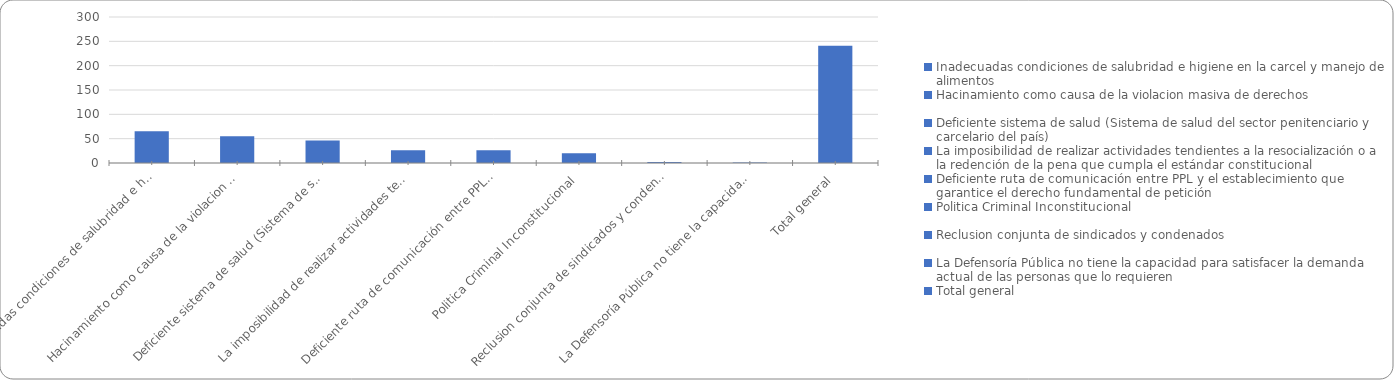
| Category | Recuento de COMPONENTES MÍNIMOS A GARANTIZAR A LA POBLACIÓN PRIVADA DE LA LIBERTAD |
|---|---|
| Inadecuadas condiciones de salubridad e higiene en la carcel y manejo de alimentos | 65 |
| Hacinamiento como causa de la violacion masiva de derechos | 55 |
| Deficiente sistema de salud (Sistema de salud del sector penitenciario y carcelario del país) | 46 |
| La imposibilidad de realizar actividades tendientes a la resocialización o a la redención de la pena que cumpla el estándar constitucional | 26 |
| Deficiente ruta de comunicación entre PPL y el establecimiento que garantice el derecho fundamental de petición | 26 |
| Politica Criminal Inconstitucional | 20 |
| Reclusion conjunta de sindicados y condenados | 2 |
| La Defensoría Pública no tiene la capacidad para satisfacer la demanda actual de las personas que lo requieren | 1 |
| Total general | 241 |